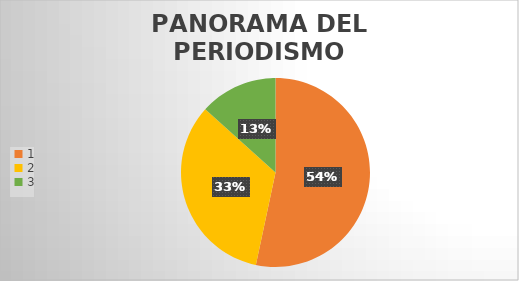
| Category | Series 0 |
|---|---|
| 0 | 8 |
| 1 | 5 |
| 2 | 2 |